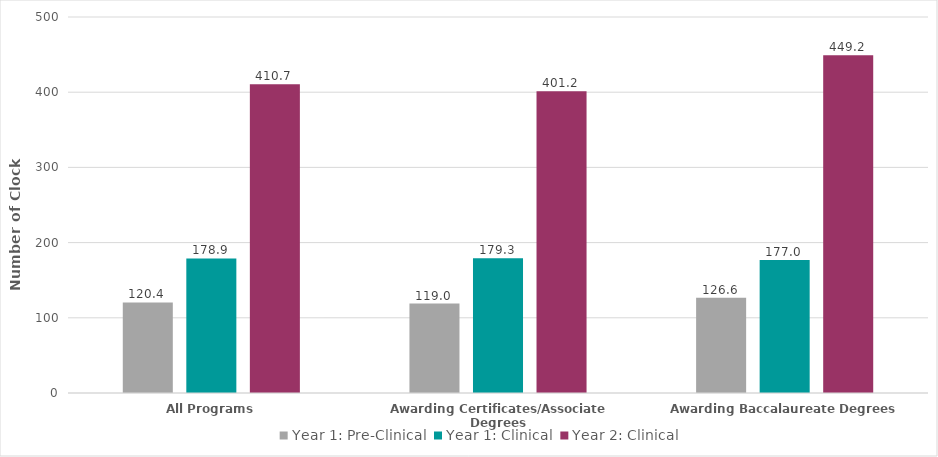
| Category | Year 1: Pre-Clinical | Year 1: Clinical | Year 2: Clinical |
|---|---|---|---|
| All Programs | 120.4 | 178.9 | 410.7 |
| Awarding Certificates/Associate Degrees | 119 | 179.3 | 401.2 |
| Awarding Baccalaureate Degrees | 126.6 | 177 | 449.2 |